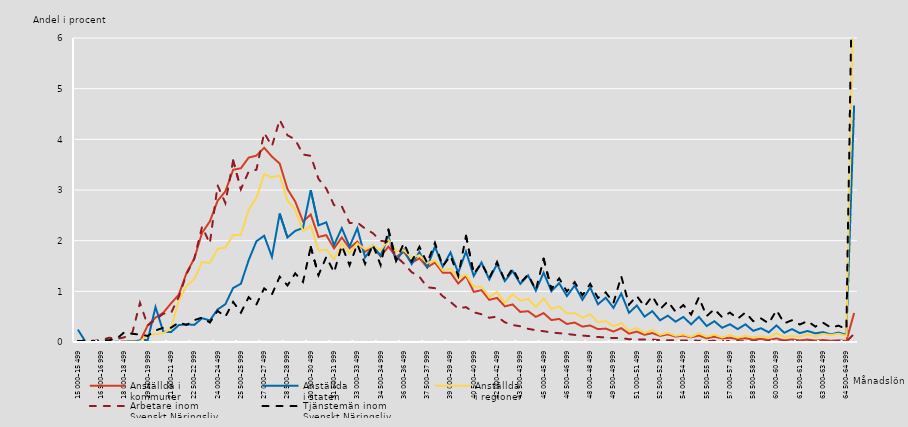
| Category | Anställda i 
kommuner | Anställda 
i staten | Anställda 
i regioner | Arbetare inom 
Svenskt Näringsliv | Tjänstemän inom
Svenskt Näringsliv |
|---|---|---|---|---|---|
| 15 000–15 499 | 0.001 | 0.244 | 0.005 | 0.021 | 0.017 |
| 15 500–15 999 | 0 | 0.002 | 0.003 | 0.022 | 0.026 |
| 16 000–16 499 | 0 | 0 | 0 | 0.024 | 0.018 |
| 16 500–16 999 | 0 | 0 | 0.001 | 0.031 | 0.028 |
| 17 000–17 499 | 0.001 | 0 | 0.001 | 0.085 | 0.034 |
| 17 500–17 999 | 0 | 0.003 | 0.002 | 0.06 | 0.064 |
| 18 000–18 499 | 0.011 | 0.002 | 0.003 | 0.093 | 0.195 |
| 18 500–18 999 | 0.009 | 0.003 | 0.001 | 0.174 | 0.161 |
| 19 000–19 499 | 0.015 | 0.034 | 0.009 | 0.773 | 0.148 |
| 19 500–19 999 | 0.328 | 0.04 | 0.138 | 0.327 | 0.12 |
| 20 000–20 499 | 0.481 | 0.69 | 0.156 | 0.442 | 0.229 |
| 20 500–20 999 | 0.577 | 0.205 | 0.175 | 0.558 | 0.279 |
| 21 000–21 499 | 0.763 | 0.195 | 0.264 | 0.572 | 0.282 |
| 21 500–21 999 | 0.933 | 0.333 | 0.817 | 0.892 | 0.384 |
| 22 000–22 499 | 1.363 | 0.35 | 1.107 | 1.341 | 0.336 |
| 22 500–22 999 | 1.648 | 0.337 | 1.244 | 1.647 | 0.431 |
| 23 000–23 499 | 2.154 | 0.469 | 1.577 | 2.275 | 0.482 |
| 23 500–23 999 | 2.381 | 0.426 | 1.562 | 1.944 | 0.384 |
| 24 000–24 499 | 2.787 | 0.642 | 1.836 | 3.092 | 0.614 |
| 24 500–24 999 | 2.972 | 0.746 | 1.862 | 2.743 | 0.498 |
| 25 000–25 499 | 3.398 | 1.065 | 2.112 | 3.585 | 0.792 |
| 25 500–25 999 | 3.43 | 1.149 | 2.115 | 3.015 | 0.579 |
| 26 000–26 499 | 3.639 | 1.615 | 2.607 | 3.363 | 0.883 |
| 26 500–26 999 | 3.678 | 1.988 | 2.847 | 3.4 | 0.742 |
| 27 000–27 499 | 3.833 | 2.097 | 3.312 | 4.128 | 1.058 |
| 27 500–27 999 | 3.659 | 1.68 | 3.25 | 3.865 | 0.939 |
| 28 000–28 499 | 3.521 | 2.535 | 3.288 | 4.385 | 1.289 |
| 28 500–28 999 | 3.018 | 2.063 | 2.791 | 4.08 | 1.116 |
| 29 000–29 499 | 2.772 | 2.193 | 2.61 | 3.996 | 1.354 |
| 29 500–29 999 | 2.38 | 2.25 | 2.188 | 3.701 | 1.185 |
| 30 000–30 499 | 2.515 | 2.998 | 2.297 | 3.674 | 1.875 |
| 30 500–30 999 | 2.073 | 2.302 | 1.802 | 3.22 | 1.321 |
| 31 000–31 499 | 2.109 | 2.362 | 1.826 | 3.027 | 1.679 |
| 31 500–31 999 | 1.849 | 1.913 | 1.634 | 2.702 | 1.374 |
| 32 000–32 499 | 2.062 | 2.247 | 1.945 | 2.677 | 1.903 |
| 32 500–32 999 | 1.851 | 1.884 | 1.75 | 2.348 | 1.515 |
| 33 000–33 499 | 1.982 | 2.245 | 1.949 | 2.358 | 1.931 |
| 33 500–33 999 | 1.78 | 1.669 | 1.83 | 2.239 | 1.543 |
| 34 000–34 499 | 1.886 | 1.895 | 1.9 | 2.148 | 1.92 |
| 34 500–34 999 | 1.689 | 1.705 | 1.817 | 1.997 | 1.518 |
| 35 000–35 499 | 1.882 | 2.079 | 2.017 | 1.979 | 2.22 |
| 35 500–35 999 | 1.679 | 1.604 | 1.794 | 1.691 | 1.606 |
| 36 000–36 499 | 1.779 | 1.822 | 1.81 | 1.547 | 1.952 |
| 36 500–36 999 | 1.562 | 1.537 | 1.664 | 1.378 | 1.592 |
| 37 000–37 499 | 1.652 | 1.776 | 1.713 | 1.289 | 1.88 |
| 37 500–37 999 | 1.473 | 1.475 | 1.558 | 1.08 | 1.558 |
| 38 000–38 499 | 1.568 | 1.885 | 1.618 | 1.063 | 1.957 |
| 38 500–38 999 | 1.368 | 1.484 | 1.412 | 0.904 | 1.497 |
| 39 000–39 499 | 1.369 | 1.768 | 1.447 | 0.793 | 1.7 |
| 39 500–39 999 | 1.154 | 1.367 | 1.27 | 0.659 | 1.305 |
| 40 000–40 499 | 1.303 | 1.785 | 1.329 | 0.689 | 2.097 |
| 40 500–40 999 | 0.989 | 1.304 | 1.094 | 0.586 | 1.347 |
| 41 000–41 499 | 1.023 | 1.569 | 1.091 | 0.548 | 1.554 |
| 41 500–41 999 | 0.832 | 1.234 | 0.887 | 0.479 | 1.263 |
| 42 000–42 499 | 0.871 | 1.542 | 0.987 | 0.501 | 1.579 |
| 42 500–42 999 | 0.703 | 1.202 | 0.774 | 0.39 | 1.213 |
| 43 000–43 499 | 0.741 | 1.4 | 0.946 | 0.335 | 1.452 |
| 43 500–43 999 | 0.593 | 1.149 | 0.815 | 0.31 | 1.168 |
| 44 000–44 499 | 0.608 | 1.315 | 0.852 | 0.26 | 1.329 |
| 44 500–44 999 | 0.496 | 1.013 | 0.69 | 0.233 | 1.027 |
| 45 000–45 499 | 0.571 | 1.368 | 0.862 | 0.213 | 1.644 |
| 45 500–45 999 | 0.433 | 1.002 | 0.651 | 0.187 | 1.046 |
| 46 000–46 499 | 0.456 | 1.162 | 0.702 | 0.174 | 1.256 |
| 46 500–46 999 | 0.355 | 0.907 | 0.565 | 0.159 | 0.996 |
| 47 000–47 499 | 0.384 | 1.113 | 0.57 | 0.14 | 1.182 |
| 47 500–47 999 | 0.303 | 0.833 | 0.481 | 0.127 | 0.922 |
| 48 000–48 499 | 0.326 | 1.075 | 0.548 | 0.115 | 1.147 |
| 48 500–48 999 | 0.254 | 0.745 | 0.39 | 0.099 | 0.87 |
| 49 000–49 499 | 0.264 | 0.873 | 0.414 | 0.089 | 0.979 |
| 49 500–49 999 | 0.207 | 0.674 | 0.31 | 0.077 | 0.772 |
| 50 000–50 499 | 0.273 | 0.957 | 0.374 | 0.078 | 1.296 |
| 50 500–50 999 | 0.165 | 0.576 | 0.223 | 0.055 | 0.738 |
| 51 000–51 499 | 0.205 | 0.72 | 0.275 | 0.052 | 0.908 |
| 51 500–51 999 | 0.142 | 0.5 | 0.178 | 0.049 | 0.702 |
| 52 000–52 499 | 0.176 | 0.608 | 0.239 | 0.049 | 0.906 |
| 52 500–52 999 | 0.121 | 0.429 | 0.141 | 0.036 | 0.646 |
| 53 000–53 499 | 0.152 | 0.52 | 0.18 | 0.035 | 0.803 |
| 53 500–53 999 | 0.107 | 0.401 | 0.123 | 0.037 | 0.596 |
| 54 000–54 499 | 0.126 | 0.495 | 0.149 | 0.028 | 0.73 |
| 54 500–54 999 | 0.092 | 0.349 | 0.102 | 0.029 | 0.542 |
| 55 000–55 499 | 0.128 | 0.496 | 0.174 | 0.027 | 0.88 |
| 55 500–55 999 | 0.074 | 0.315 | 0.104 | 0.022 | 0.51 |
| 56 000–56 499 | 0.104 | 0.41 | 0.144 | 0.022 | 0.649 |
| 56 500–56 999 | 0.07 | 0.281 | 0.089 | 0.019 | 0.488 |
| 57 000–57 499 | 0.084 | 0.35 | 0.138 | 0.018 | 0.581 |
| 57 500–57 999 | 0.057 | 0.255 | 0.083 | 0.018 | 0.458 |
| 58 000–58 499 | 0.074 | 0.348 | 0.123 | 0.015 | 0.583 |
| 58 500–58 999 | 0.047 | 0.221 | 0.087 | 0.014 | 0.411 |
| 59 000–59 499 | 0.062 | 0.272 | 0.115 | 0.011 | 0.466 |
| 59 500–59 999 | 0.038 | 0.191 | 0.088 | 0.013 | 0.367 |
| 60 000–60 499 | 0.07 | 0.327 | 0.172 | 0.012 | 0.628 |
| 60 500–60 999 | 0.032 | 0.182 | 0.098 | 0.01 | 0.369 |
| 61 000–61 499 | 0.052 | 0.255 | 0.119 | 0.008 | 0.43 |
| 61 500–61 999 | 0.031 | 0.175 | 0.105 | 0.007 | 0.345 |
| 62 000–62 499 | 0.048 | 0.218 | 0.148 | 0.009 | 0.412 |
| 62 500–62 999 | 0.029 | 0.171 | 0.113 | 0.007 | 0.305 |
| 63 000–63 499 | 0.039 | 0.195 | 0.161 | 0.006 | 0.381 |
| 63 500–63 999 | 0.025 | 0.15 | 0.138 | 0.018 | 0.284 |
| 64 000–64 499 | 0.034 | 0.187 | 0.165 | 0.01 | 0.323 |
| 64 500–64 999 | 0.019 | 0.14 | 0.121 | 0.006 | 0.251 |
| 65 000– | 0.573 | 4.668 | 7.645 | 0.161 | 9.656 |